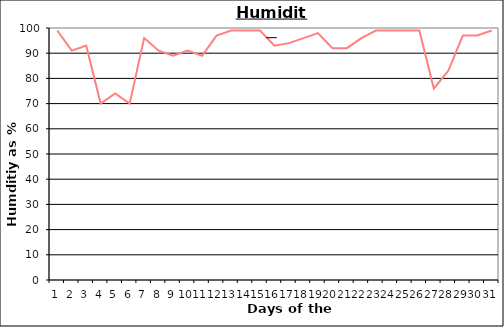
| Category | Series 0 |
|---|---|
| 0 | 99 |
| 1 | 91 |
| 2 | 93 |
| 3 | 70 |
| 4 | 74 |
| 5 | 70 |
| 6 | 96 |
| 7 | 91 |
| 8 | 89 |
| 9 | 91 |
| 10 | 89 |
| 11 | 97 |
| 12 | 99 |
| 13 | 99 |
| 14 | 99 |
| 15 | 93 |
| 16 | 94 |
| 17 | 96 |
| 18 | 98 |
| 19 | 92 |
| 20 | 92 |
| 21 | 96 |
| 22 | 99 |
| 23 | 99 |
| 24 | 99 |
| 25 | 99 |
| 26 | 76 |
| 27 | 83 |
| 28 | 97 |
| 29 | 97 |
| 30 | 99 |